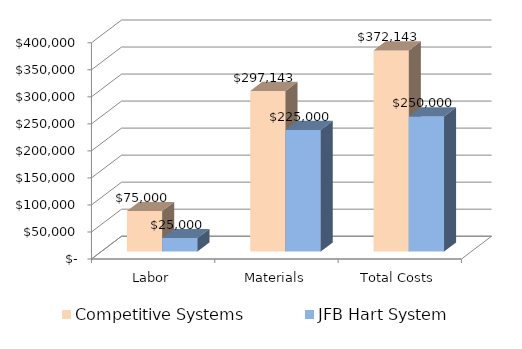
| Category | Competitive Systems | JFB Hart System |
|---|---|---|
| Labor | 75000 | 25000 |
| Materials | 297142.857 | 225000 |
| Total Costs | 372142.857 | 250000 |